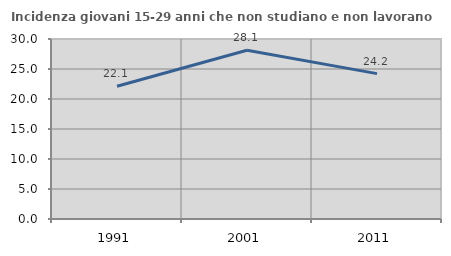
| Category | Incidenza giovani 15-29 anni che non studiano e non lavorano  |
|---|---|
| 1991.0 | 22.133 |
| 2001.0 | 28.116 |
| 2011.0 | 24.227 |